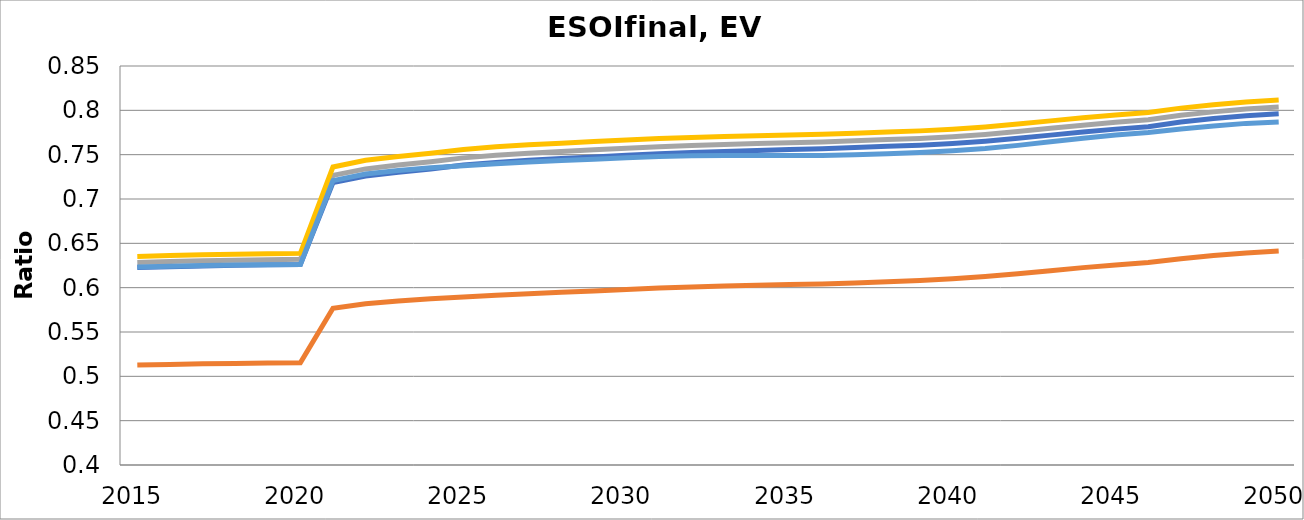
| Category |  ESOIfinal [LMO] |  ESOIfinal [NMC622] |  ESOIfinal [NMC811] |  ESOIfinal [NCA] |  ESOIfinal [LFP] |
|---|---|---|---|---|---|
| 2015.0 | 0.513 | 0.623 | 0.628 | 0.635 | 0.623 |
| 2016.0 | 0.513 | 0.624 | 0.629 | 0.636 | 0.624 |
| 2017.0 | 0.514 | 0.625 | 0.63 | 0.637 | 0.625 |
| 2018.0 | 0.515 | 0.625 | 0.631 | 0.638 | 0.625 |
| 2019.0 | 0.515 | 0.626 | 0.632 | 0.638 | 0.626 |
| 2020.0 | 0.515 | 0.626 | 0.632 | 0.639 | 0.626 |
| 2021.0 | 0.577 | 0.719 | 0.727 | 0.736 | 0.721 |
| 2022.0 | 0.582 | 0.726 | 0.734 | 0.744 | 0.728 |
| 2023.0 | 0.585 | 0.73 | 0.738 | 0.748 | 0.732 |
| 2024.0 | 0.587 | 0.734 | 0.742 | 0.752 | 0.735 |
| 2025.0 | 0.589 | 0.738 | 0.746 | 0.756 | 0.738 |
| 2026.0 | 0.591 | 0.741 | 0.749 | 0.759 | 0.74 |
| 2027.0 | 0.593 | 0.744 | 0.752 | 0.761 | 0.742 |
| 2028.0 | 0.595 | 0.746 | 0.754 | 0.763 | 0.743 |
| 2029.0 | 0.596 | 0.748 | 0.756 | 0.765 | 0.745 |
| 2030.0 | 0.598 | 0.749 | 0.757 | 0.767 | 0.746 |
| 2031.0 | 0.6 | 0.751 | 0.759 | 0.768 | 0.748 |
| 2032.0 | 0.601 | 0.753 | 0.76 | 0.769 | 0.749 |
| 2033.0 | 0.602 | 0.754 | 0.762 | 0.77 | 0.749 |
| 2034.0 | 0.603 | 0.755 | 0.762 | 0.771 | 0.749 |
| 2035.0 | 0.604 | 0.756 | 0.763 | 0.772 | 0.749 |
| 2036.0 | 0.604 | 0.757 | 0.764 | 0.773 | 0.749 |
| 2037.0 | 0.605 | 0.758 | 0.766 | 0.774 | 0.75 |
| 2038.0 | 0.607 | 0.759 | 0.767 | 0.776 | 0.751 |
| 2039.0 | 0.608 | 0.761 | 0.768 | 0.777 | 0.752 |
| 2040.0 | 0.61 | 0.763 | 0.77 | 0.779 | 0.754 |
| 2041.0 | 0.612 | 0.765 | 0.773 | 0.781 | 0.757 |
| 2042.0 | 0.616 | 0.768 | 0.776 | 0.784 | 0.76 |
| 2043.0 | 0.619 | 0.772 | 0.78 | 0.788 | 0.765 |
| 2044.0 | 0.623 | 0.776 | 0.783 | 0.792 | 0.769 |
| 2045.0 | 0.626 | 0.779 | 0.786 | 0.795 | 0.772 |
| 2046.0 | 0.628 | 0.782 | 0.789 | 0.798 | 0.775 |
| 2047.0 | 0.633 | 0.787 | 0.794 | 0.802 | 0.779 |
| 2048.0 | 0.636 | 0.791 | 0.798 | 0.806 | 0.782 |
| 2049.0 | 0.639 | 0.794 | 0.802 | 0.81 | 0.785 |
| 2050.0 | 0.641 | 0.796 | 0.804 | 0.812 | 0.787 |